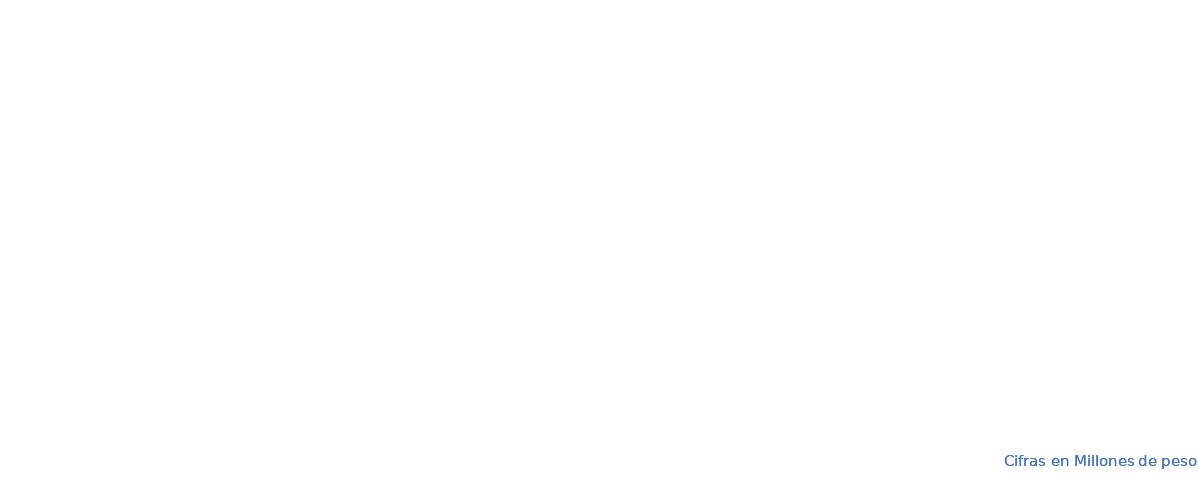
| Category | APROPIACION | COMPROMISOS |  OBLIGACIONES |  PAGOS |
|---|---|---|---|---|
| A-FUNCIONAMIENTO | 99785.985 | 78550.677 | 76517.358 | 73525.238 |
| B-SERVICIO DE LA DEUDA PÚBLICA | 1167604.335 | 954990.753 | 954990.753 | 954990.753 |
| C- INVERSION | 4505182.025 | 4439873.98 | 398275.147 | 391610.44 |